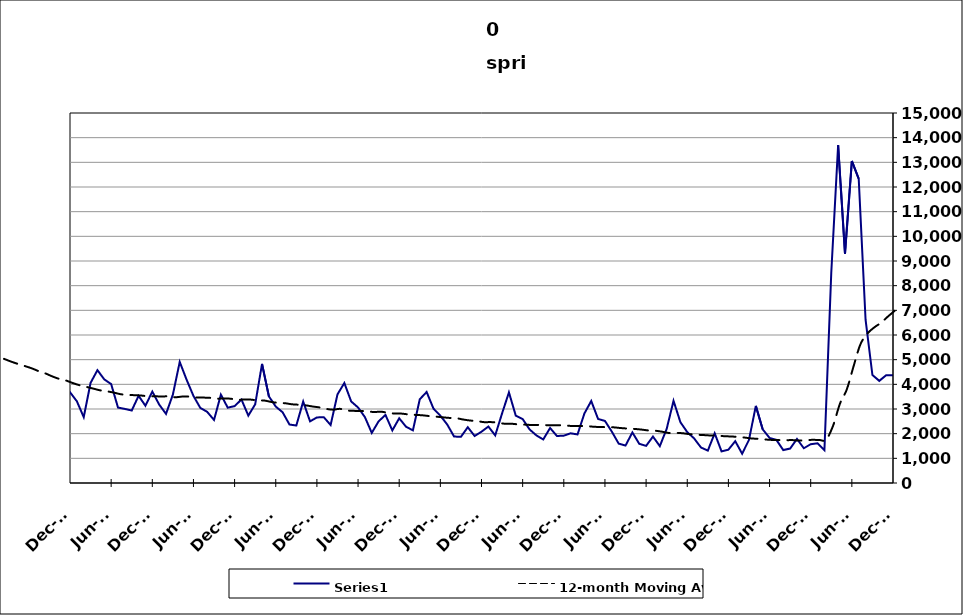
| Category | Series 0 |
|---|---|
| 2005-05-31 | 3131 |
| 2005-06-30 | 2953 |
| 2005-07-31 | 2452 |
| 2005-08-31 | 1842 |
| 2005-09-30 | 1444 |
| 2005-10-31 | 2141 |
| 2005-11-30 | 1626 |
| 2005-12-31 | 1998 |
| 2006-01-31 | 1588 |
| 2006-02-28 | 1445 |
| 2006-03-31 | 1949 |
| 2006-04-30 | 2959 |
| 2006-05-31 | 2381 |
| 2006-06-30 | 2220 |
| 2006-07-31 | 2123 |
| 2006-08-31 | 1525 |
| 2006-09-30 | 1615 |
| 2006-10-31 | 1860 |
| 2006-11-30 | 1507 |
| 2006-12-31 | 1965 |
| 2007-01-31 | 2023 |
| 2007-02-28 | 1616 |
| 2007-03-31 | 2671 |
| 2007-04-30 | 3721 |
| 2007-05-31 | 2286 |
| 2007-06-30 | 3372 |
| 2007-07-30 | 2459 |
| 2007-08-31 | 1980 |
| 2007-09-30 | 2331 |
| 2007-10-31 | 2490 |
| 2007-11-15 | 1970 |
| 2007-12-15 09:36:00 | 2318 |
| 2008-01-14 19:12:00 | 2557 |
| 2008-02-14 04:48:00 | 2676 |
| 2008-03-15 14:24:00 | 3345 |
| 2008-04-15 | 4771 |
| 2008-05-15 09:36:00 | 3529 |
| 2008-06-14 19:12:00 | 4044 |
| 2008-07-15 04:48:00 | 3468 |
| 2008-08-14 14:24:00 | 2936 |
| 2008-09-14 | 3327 |
| 2008-10-14 09:36:00 | 4398 |
| 2008-11-13 19:12:00 | 4288 |
| 2008-12-14 04:48:00 | 4919 |
| 2009-01-13 14:24:00 | 4529 |
| 2009-02-13 | 4588 |
| 2009-03-15 09:36:00 | 6230 |
| 2009-04-14 19:12:00 | 6528 |
| 2009-05-15 04:48:00 | 5710 |
| 2009-06-14 14:24:00 | 5729 |
| 2009-07-15 | 5181 |
| 2009-08-14 09:36:00 | 4471 |
| 2009-09-13 19:12:00 | 4514 |
| 2009-10-14 04:48:00 | 4928 |
| 2009-11-13 14:24:00 | 4288 |
| 2009-12-14 | 4919 |
| 2010-01-13 09:36:00 | 4406 |
| 2010-02-12 19:12:00 | 3451 |
| 2010-03-15 04:48:00 | 4910 |
| 2010-04-14 14:24:00 | 5413 |
| 2010-05-15 | 4664 |
| 2010-06-14 09:36:00 | 4652 |
| 2010-07-14 19:12:00 | 3833 |
| 2010-08-14 04:48:00 | 3333 |
| 2010-09-13 14:24:00 | 3073 |
| 2010-10-14 | 3708 |
| 2010-11-13 09:36:00 | 3510 |
| 2010-12-13 19:12:00 | 3680 |
| 2011-01-13 04:48:00 | 3314 |
| 2011-02-12 14:24:00 | 2671 |
| 2011-03-15 | 4059 |
| 2011-04-14 09:36:00 | 4574 |
| 2011-05-14 19:12:00 | 4200 |
| 2011-06-14 04:48:00 | 4010 |
| 2011-07-14 14:24:00 | 3058 |
| 2011-08-14 | 3003 |
| 2011-09-13 09:36:00 | 2938 |
| 2011-10-13 19:12:00 | 3534 |
| 2011-11-13 04:48:00 | 3132 |
| 2011-12-13 14:24:00 | 3706 |
| 2012-01-13 | 3182 |
| 2012-02-12 09:36:00 | 2802 |
| 2012-03-13 19:12:00 | 3584 |
| 2012-04-13 04:48:00 | 4909 |
| 2012-05-13 14:24:00 | 4188 |
| 2012-06-13 | 3531 |
| 2012-07-13 09:36:00 | 3044 |
| 2012-08-12 19:12:00 | 2885 |
| 2012-09-12 04:48:00 | 2556 |
| 2012-10-12 14:24:00 | 3582 |
| 2012-11-12 | 3054 |
| 2012-12-12 09:36:00 | 3117 |
| 2013-01-11 19:12:00 | 3385 |
| 2013-02-11 04:48:00 | 2732 |
| 2013-03-13 14:24:00 | 3189 |
| 2013-04-13 | 4828 |
| 2013-05-13 09:36:00 | 3513 |
| 2013-06-12 19:12:00 | 3099 |
| 2013-07-13 04:48:00 | 2867 |
| 2013-08-12 14:24:00 | 2371 |
| 2013-09-12 | 2330 |
| 2013-10-12 09:36:00 | 3301 |
| 2013-11-11 19:12:00 | 2499 |
| 2013-12-12 04:48:00 | 2658 |
| 2014-01-11 14:24:00 | 2669 |
| 2014-02-11 | 2351 |
| 2014-03-13 09:36:00 | 3592 |
| 2014-04-12 19:12:00 | 4054 |
| 2014-05-13 04:48:00 | 3305 |
| 2014-06-12 14:24:00 | 3062 |
| 2014-07-13 | 2671 |
| 2014-08-12 09:36:00 | 2031 |
| 2014-09-11 19:12:00 | 2501 |
| 2014-10-12 04:48:00 | 2759 |
| 2014-11-11 14:24:00 | 2132 |
| 2014-12-12 | 2624 |
| 2015-01-11 09:36:00 | 2280 |
| 2015-02-10 19:12:00 | 2135 |
| 2015-03-13 04:48:00 | 3396 |
| 2015-04-12 14:24:00 | 3689 |
| 2015-05-13 | 3015 |
| 2015-06-12 09:36:00 | 2729 |
| 2015-07-12 19:12:00 | 2373 |
| 2015-08-12 04:48:00 | 1884 |
| 2015-09-11 14:24:00 | 1872 |
| 2015-10-12 | 2261 |
| 2015-11-11 09:36:00 | 1906 |
| 2015-12-11 19:12:00 | 2079 |
| 2016-01-11 04:48:00 | 2289 |
| 2016-02-10 14:24:00 | 1931 |
| 2016-03-12 | 2822 |
| 2016-04-11 09:36:00 | 3674 |
| 2016-05-11 19:12:00 | 2728 |
| 2016-06-11 04:48:00 | 2594 |
| 2016-07-11 14:24:00 | 2175 |
| 2016-08-11 | 1931 |
| 2016-09-10 09:36:00 | 1765 |
| 2016-10-10 19:12:00 | 2230 |
| 2016-11-10 04:48:00 | 1905 |
| 2016-12-10 14:24:00 | 1919 |
| 2017-01-10 | 2015 |
| 2017-02-09 09:36:00 | 1968 |
| 2017-03-11 19:12:00 | 2817 |
| 2017-04-11 04:48:00 | 3325 |
| 2017-05-11 14:24:00 | 2596 |
| 2017-06-11 | 2516 |
| 2017-07-11 09:36:00 | 2084 |
| 2017-08-10 19:12:00 | 1597 |
| 2017-09-10 04:48:00 | 1518 |
| 2017-10-10 14:24:00 | 2050 |
| 2017-11-10 | 1589 |
| 2017-12-10 09:36:00 | 1505 |
| 2018-01-09 19:12:00 | 1882 |
| 2018-02-09 04:48:00 | 1495 |
| 2018-03-11 14:24:00 | 2194 |
| 2018-04-11 | 3332 |
| 2018-05-11 09:36:00 | 2466 |
| 2018-06-10 19:12:00 | 2063 |
| 2018-07-11 04:48:00 | 1809 |
| 2018-08-10 14:24:00 | 1440 |
| 2018-09-10 | 1313 |
| 2018-10-10 09:36:00 | 2015 |
| 2018-11-09 19:12:00 | 1282 |
| 2018-12-10 04:48:00 | 1351 |
| 2019-01-09 14:24:00 | 1695 |
| 2019-02-09 | 1189 |
| 2019-03-11 09:36:00 | 1746 |
| 2019-04-10 19:12:00 | 3126 |
| 2019-05-11 04:48:00 | 2174 |
| 2019-06-10 14:24:00 | 1827 |
| 2019-07-11 | 1744 |
| 2019-08-10 09:36:00 | 1335 |
| 2019-09-09 19:12:00 | 1398 |
| 2019-10-10 04:48:00 | 1790 |
| 2019-11-09 14:24:00 | 1407 |
| 2019-12-10 | 1573 |
| 2020-01-09 09:36:00 | 1610 |
| 2020-02-08 19:12:00 | 1333 |
| 2020-03-10 04:48:00 | 8532 |
| 2020-04-09 14:24:00 | 13699 |
| 2020-05-10 | 9300 |
| 2020-06-09 09:36:00 | 13055 |
| 2020-07-09 19:12:00 | 12333 |
| 2020-08-09 04:48:00 | 6620 |
| 2020-09-08 14:24:00 | 4377 |
| 2020-10-09 | 4142 |
| 2020-11-08 09:36:00 | 4370 |
| 2020-12-08 19:12:00 | 4370 |